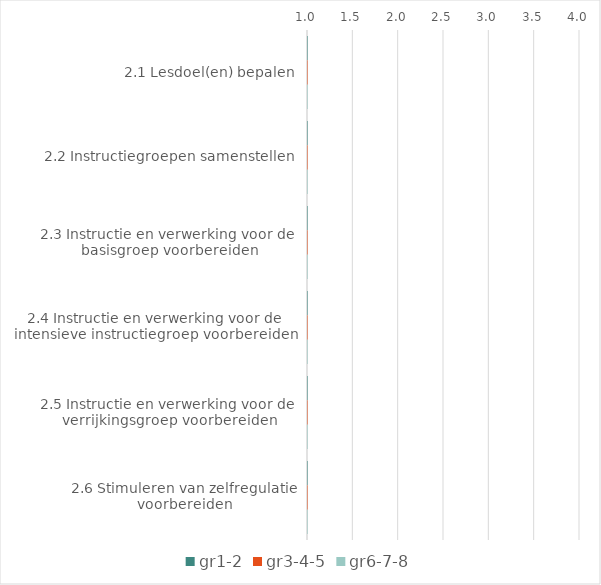
| Category | gr1-2 | gr3-4-5 | gr6-7-8 |
|---|---|---|---|
| 2.1 Lesdoel(en) bepalen | 0 | 0 | 0 |
| 2.2 Instructiegroepen samenstellen | 0 | 0 | 0 |
| 2.3 Instructie en verwerking voor de basisgroep voorbereiden | 0 | 0 | 0 |
| 2.4 Instructie en verwerking voor de intensieve instructiegroep voorbereiden | 0 | 0 | 0 |
| 2.5 Instructie en verwerking voor de verrijkingsgroep voorbereiden | 0 | 0 | 0 |
| 2.6 Stimuleren van zelfregulatie voorbereiden | 0 | 0 | 0 |